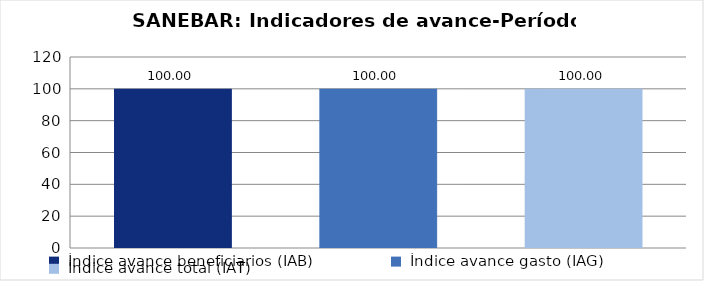
| Category | Total Programa |
|---|---|
| Índice avance beneficiarios (IAB)  | 100 |
| Índice avance gasto (IAG) | 100 |
| Índice avance total (IAT)  | 100 |